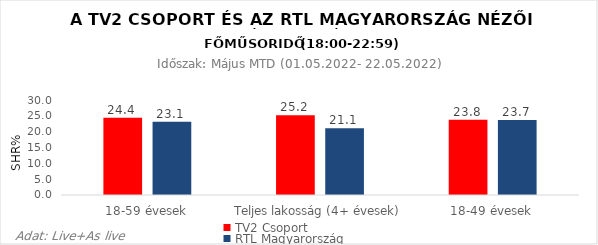
| Category | TV2 Csoport | RTL Magyarország |
|---|---|---|
| 18-59 évesek | 24.4 | 23.1 |
| Teljes lakosság (4+ évesek) | 25.2 | 21.1 |
| 18-49 évesek | 23.8 | 23.7 |